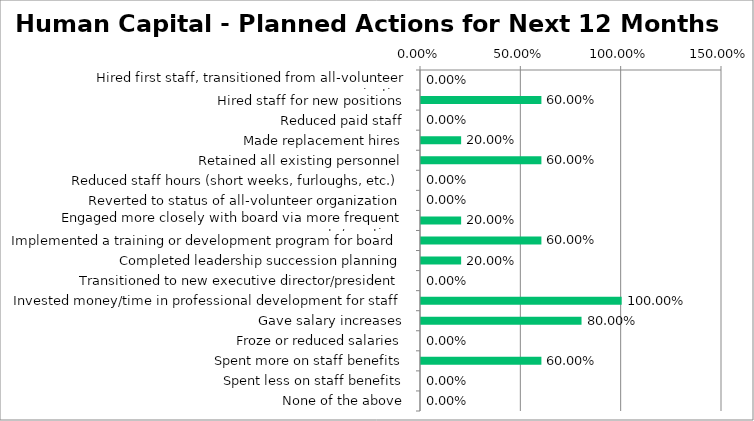
| Category | Responses |
|---|---|
| Hired first staff, transitioned from all-volunteer organization | 0 |
| Hired staff for new positions | 0.6 |
| Reduced paid staff | 0 |
| Made replacement hires | 0.2 |
| Retained all existing personnel | 0.6 |
| Reduced staff hours (short weeks, furloughs, etc.) | 0 |
| Reverted to status of all-volunteer organization | 0 |
| Engaged more closely with board via more frequent reports/meetings | 0.2 |
| Implemented a training or development program for board | 0.6 |
| Completed leadership succession planning | 0.2 |
| Transitioned to new executive director/president | 0 |
| Invested money/time in professional development for staff | 1 |
| Gave salary increases | 0.8 |
| Froze or reduced salaries | 0 |
| Spent more on staff benefits | 0.6 |
| Spent less on staff benefits | 0 |
| None of the above | 0 |